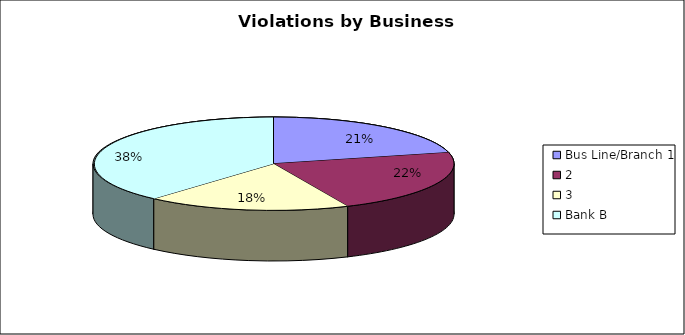
| Category | Series 0 |
|---|---|
| Bus Line/Branch 1 | 22 |
| 2 | 23 |
| 3 | 19 |
| Bank B | 40 |